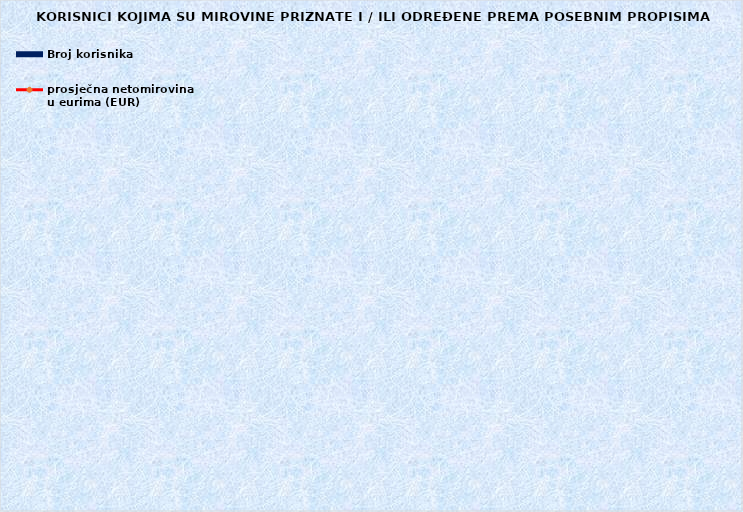
| Category | Broj korisnika |
|---|---|
|      a) radnici na poslovima ovlaštenih službenih osoba u tijelima unutarnjih 
poslova i pravosuđa, kojima je pravo na mirovinu priznato prema propisima
koji su bili na snazi do stupanja na snagu Zakona o pravima iz mirovinskog
osiguranja DVO, PS i OSO | 6866 |
|      b) radnici na  poslovima policijskih službenika, ovlaštenih službenih osoba pravosuđa i službene osobe s posebnim dužnostima i ovlastima u sigurnosno obavještajnom sustavu RH koji su pravo na mirovinu ostvarili prema Zakonu o pravima DVO, PS i OSO | 9708 |
|      c) radnici na poslovima razminiranja | 676 |
| Korisnici koji pravo na mirovinu ostvaruju prema Zakonu o vatrogastvu (NN 125/19)* | 388 |
| Djelatne vojne osobe - DVO  | 16169 |
| Pripadnici Hrvatske domovinske vojske od 1941. do 1945. godine | 1680 |
| Bivši politički zatvorenici | 1980 |
| Hrvatski branitelji iz Domovinskog rata - ZOHBDR | 71481 |
| Mirovine priznate prema općim propisima, a određene prema
ZOHBDR - u iz 2017. (čl. 27., 35., 48. i 49. stavak 2.)  | 59515 |
| Pripadnici bivše Jugoslavenske narodne armije - JNA | 3416 |
| Pripadnici bivše Jugoslavenske narodne armije - JNA - čl. 185 ZOMO | 153 |
| Sudionici Narodnooslobodilačkog rata - NOR | 4500 |
| Zastupnici u Hrvatskom saboru, članovi Vlade, suci Ustavnog suda i glavni državni revizor  | 685 |
| Članovi Izvršnog vijeća Sabora, Saveznog izvršnog vijeća i administrativno umirovljeni javni službenici | 61 |
| Bivši službenici u saveznim tijelima bivše SFRJ - članak 38. ZOMO | 17 |
| Redoviti članovi Hrvatske akademije znanosti i umjetnosti - HAZU | 121 |
| Radnici u Istarskim ugljenokopima "Tupljak" d.d. Labin  | 244 |
| Radnici profesionalno izloženi azbestu | 810 |
| Osiguranici - članovi posade broda u međunarodnoj plovidbi i nacionalnoj plovidbi - članak 129. a stavak 2. Pomorskog zakonika | 207 |
| Korisnici koji pravo na mirovinu ostvaruju prema Zakonu o kazalištima* | 2 |
| Pripadnici Hrvatskog vijeća obrane  - HVO  | 7231 |